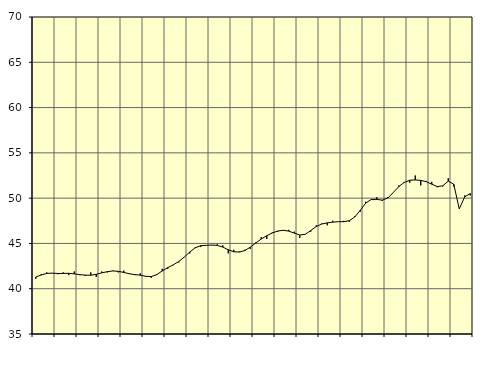
| Category | Piggar | Samtliga fast anställda (inkl. fast anställda utomlands) |
|---|---|---|
| nan | 41.1 | 41.29 |
| 1.0 | 41.6 | 41.52 |
| 1.0 | 41.8 | 41.69 |
| 1.0 | 41.7 | 41.72 |
| nan | 41.6 | 41.68 |
| 2.0 | 41.8 | 41.69 |
| 2.0 | 41.5 | 41.7 |
| 2.0 | 41.9 | 41.64 |
| nan | 41.5 | 41.55 |
| 3.0 | 41.4 | 41.5 |
| 3.0 | 41.8 | 41.49 |
| 3.0 | 41.3 | 41.59 |
| nan | 41.9 | 41.75 |
| 4.0 | 41.8 | 41.88 |
| 4.0 | 42 | 41.96 |
| 4.0 | 41.8 | 41.92 |
| nan | 42 | 41.8 |
| 5.0 | 41.7 | 41.65 |
| 5.0 | 41.5 | 41.56 |
| 5.0 | 41.7 | 41.5 |
| nan | 41.3 | 41.37 |
| 6.0 | 41.2 | 41.34 |
| 6.0 | 41.5 | 41.56 |
| 6.0 | 42.2 | 41.96 |
| nan | 42.2 | 42.33 |
| 7.0 | 42.6 | 42.64 |
| 7.0 | 42.9 | 43 |
| 7.0 | 43.5 | 43.49 |
| nan | 43.9 | 44.05 |
| 8.0 | 44.6 | 44.52 |
| 8.0 | 44.6 | 44.75 |
| 8.0 | 44.8 | 44.79 |
| nan | 44.8 | 44.82 |
| 9.0 | 44.9 | 44.78 |
| 9.0 | 44.8 | 44.6 |
| 9.0 | 43.9 | 44.3 |
| nan | 44.3 | 44.08 |
| 10.0 | 44.1 | 44.05 |
| 10.0 | 44.3 | 44.21 |
| 10.0 | 44.4 | 44.58 |
| nan | 45.1 | 45.05 |
| 11.0 | 45.7 | 45.49 |
| 11.0 | 45.5 | 45.85 |
| 11.0 | 46.2 | 46.15 |
| nan | 46.3 | 46.37 |
| 12.0 | 46.4 | 46.45 |
| 12.0 | 46.5 | 46.36 |
| 12.0 | 46.3 | 46.14 |
| nan | 45.6 | 45.93 |
| 13.0 | 46 | 46.01 |
| 13.0 | 46.3 | 46.42 |
| 13.0 | 47 | 46.87 |
| nan | 47.2 | 47.14 |
| 14.0 | 47 | 47.27 |
| 14.0 | 47.5 | 47.35 |
| 14.0 | 47.4 | 47.4 |
| nan | 47.5 | 47.4 |
| 15.0 | 47.4 | 47.51 |
| 15.0 | 48 | 47.92 |
| 15.0 | 48.5 | 48.66 |
| nan | 49.6 | 49.45 |
| 16.0 | 49.9 | 49.86 |
| 16.0 | 50.1 | 49.86 |
| 16.0 | 49.7 | 49.78 |
| nan | 50.1 | 50.01 |
| 17.0 | 50.6 | 50.62 |
| 17.0 | 51.4 | 51.27 |
| 17.0 | 51.7 | 51.74 |
| nan | 51.7 | 51.98 |
| 18.0 | 52.5 | 52.01 |
| 18.0 | 51.4 | 51.96 |
| 18.0 | 51.9 | 51.82 |
| nan | 51.8 | 51.54 |
| 19.0 | 51.2 | 51.28 |
| 19.0 | 51.3 | 51.36 |
| 19.0 | 52.2 | 51.88 |
| nan | 51.3 | 51.54 |
| 20.0 | 48.8 | 48.81 |
| 20.0 | 50.3 | 50.15 |
| 20.0 | 50.3 | 50.51 |